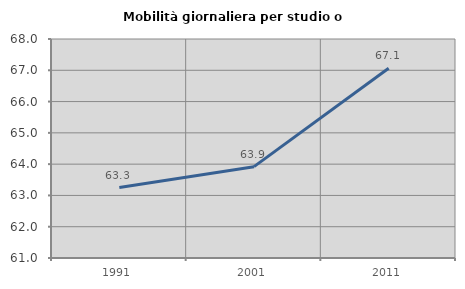
| Category | Mobilità giornaliera per studio o lavoro |
|---|---|
| 1991.0 | 63.252 |
| 2001.0 | 63.92 |
| 2011.0 | 67.064 |